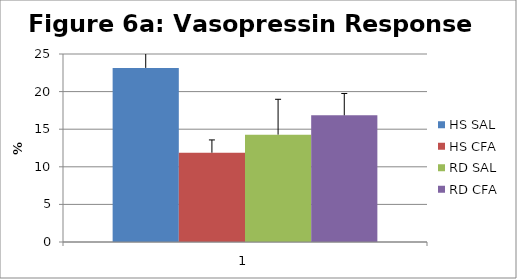
| Category | HS SAL | HS CFA | RD SAL | RD CFA |
|---|---|---|---|---|
| 0 | 23.15 | 11.873 | 14.278 | 16.85 |